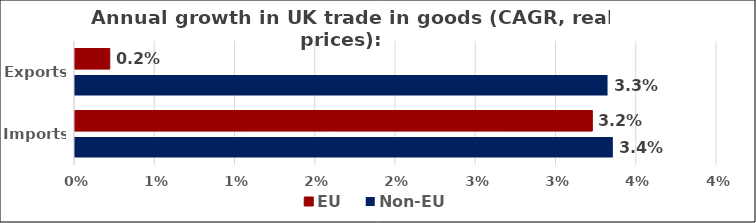
| Category | EU | Non-EU  |
|---|---|---|
| Exports  | 0.002 | 0.033 |
| Imports | 0.032 | 0.034 |